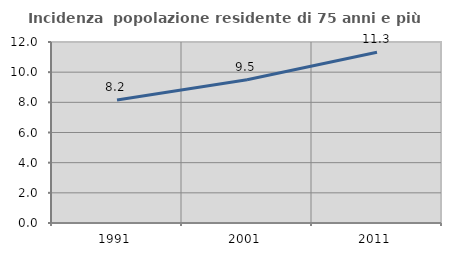
| Category | Incidenza  popolazione residente di 75 anni e più |
|---|---|
| 1991.0 | 8.157 |
| 2001.0 | 9.492 |
| 2011.0 | 11.32 |